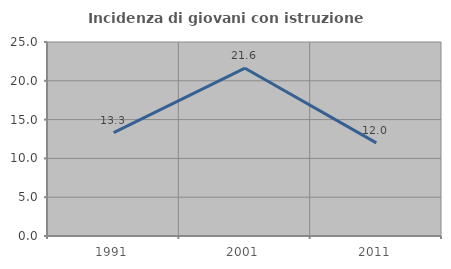
| Category | Incidenza di giovani con istruzione universitaria |
|---|---|
| 1991.0 | 13.333 |
| 2001.0 | 21.622 |
| 2011.0 | 12 |